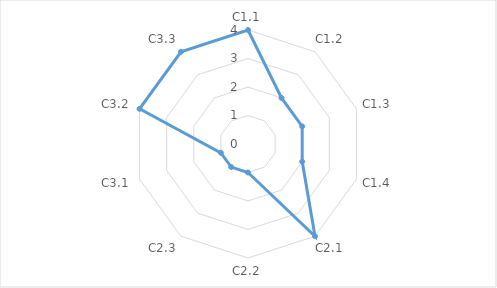
| Category | Series 0 |
|---|---|
| C1.1 | 4 |
| C1.2 | 2 |
| C1.3 | 2 |
| C1.4 | 2 |
| C2.1 | 4 |
| C2.2 | 1 |
| C2.3 | 1 |
| C3.1 | 1 |
| C3.2 | 4 |
| C3.3 | 4 |